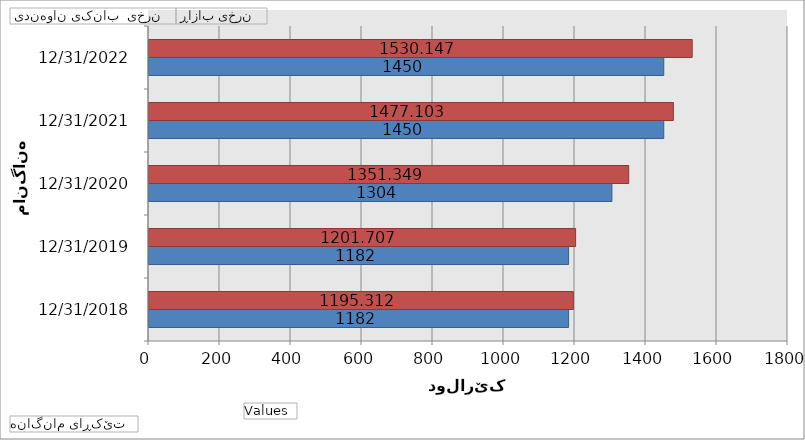
| Category |  نرخی  بانکی ناوەندی  |  نرخی بازاڕ  |
|---|---|---|
| 12/31/2018 | 1182 | 1195.312 |
| 12/31/2019 | 1182 | 1201.707 |
| 12/31/2020 | 1304 | 1351.349 |
| 12/31/2021 | 1450 | 1477.103 |
| 12/31/2022 | 1450 | 1530.147 |